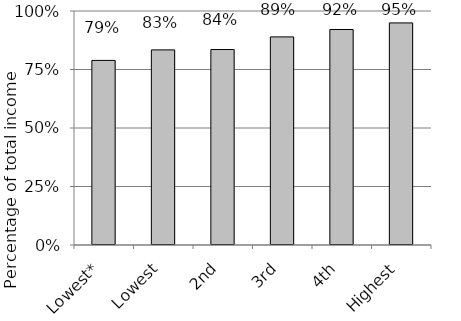
| Category | Series 2 |
|---|---|
| Lowest* | 0.789 |
| Lowest | 0.834 |
| 2nd | 0.835 |
| 3rd | 0.889 |
| 4th | 0.921 |
| Highest | 0.949 |